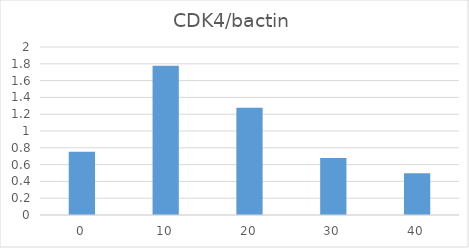
| Category | CDK4/bactin |
|---|---|
| 0.0 | 0.754 |
| 10.0 | 1.777 |
| 20.0 | 1.277 |
| 30.0 | 0.68 |
| 40.0 | 0.496 |